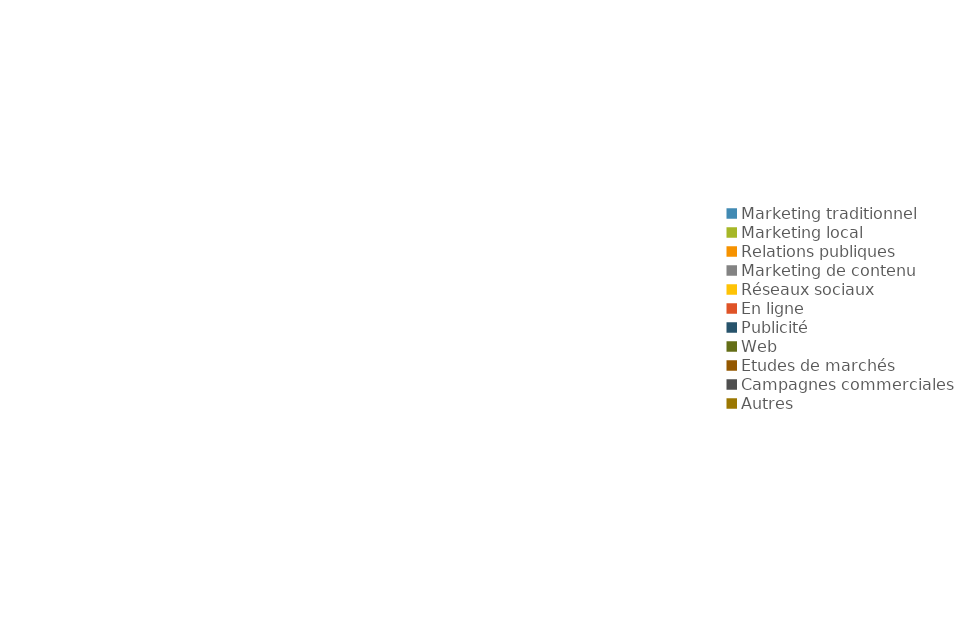
| Category | Series 0 | Series 1 |
|---|---|---|
| Marketing traditionnel | 0 | 0 |
| Marketing local | 0 | 0 |
| Relations publiques | 0 | 0 |
| Marketing de contenu | 0 | 0 |
| Réseaux sociaux | 0 | 0 |
| En ligne | 0 | 0 |
| Publicité | 0 | 0 |
| Web | 0 | 0 |
| Etudes de marchés | 0 | 0 |
| Campagnes commerciales | 0 | 0 |
| Autres | 0 | 0 |